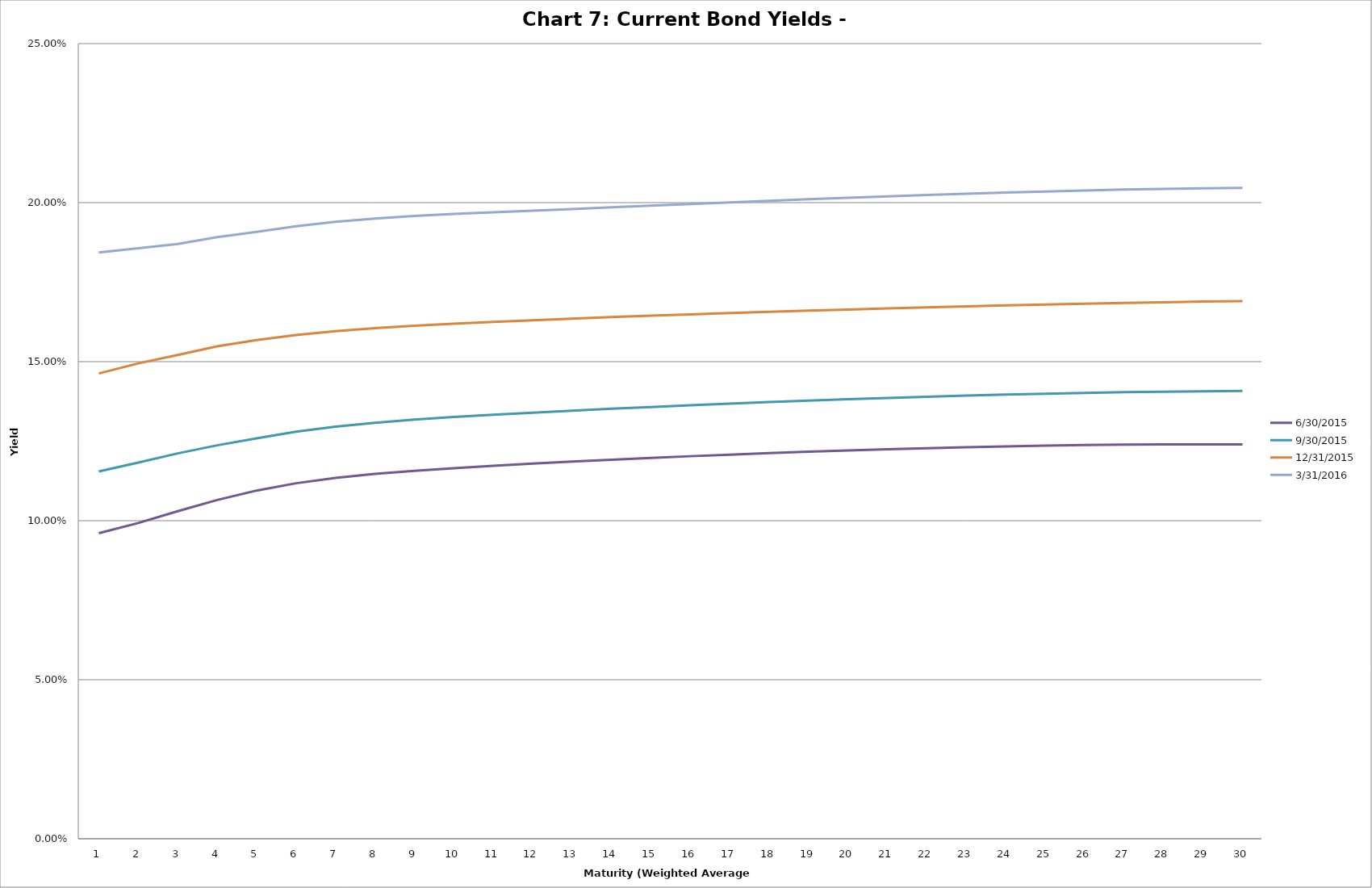
| Category | 6/30/2015 | 9/30/2015 | 12/31/2015 | 3/31/2016 |
|---|---|---|---|---|
| 0 | 0.096 | 0.115 | 0.146 | 0.184 |
| 1 | 0.099 | 0.118 | 0.149 | 0.186 |
| 2 | 0.103 | 0.121 | 0.152 | 0.187 |
| 3 | 0.107 | 0.124 | 0.155 | 0.189 |
| 4 | 0.109 | 0.126 | 0.157 | 0.191 |
| 5 | 0.112 | 0.128 | 0.158 | 0.193 |
| 6 | 0.113 | 0.13 | 0.16 | 0.194 |
| 7 | 0.115 | 0.131 | 0.161 | 0.195 |
| 8 | 0.116 | 0.132 | 0.161 | 0.196 |
| 9 | 0.117 | 0.133 | 0.162 | 0.196 |
| 10 | 0.117 | 0.133 | 0.163 | 0.197 |
| 11 | 0.118 | 0.134 | 0.163 | 0.197 |
| 12 | 0.119 | 0.135 | 0.164 | 0.198 |
| 13 | 0.119 | 0.135 | 0.164 | 0.199 |
| 14 | 0.12 | 0.136 | 0.164 | 0.199 |
| 15 | 0.12 | 0.136 | 0.165 | 0.2 |
| 16 | 0.121 | 0.137 | 0.165 | 0.2 |
| 17 | 0.121 | 0.137 | 0.166 | 0.201 |
| 18 | 0.122 | 0.138 | 0.166 | 0.201 |
| 19 | 0.122 | 0.138 | 0.166 | 0.202 |
| 20 | 0.122 | 0.139 | 0.167 | 0.202 |
| 21 | 0.123 | 0.139 | 0.167 | 0.202 |
| 22 | 0.123 | 0.139 | 0.167 | 0.203 |
| 23 | 0.123 | 0.14 | 0.168 | 0.203 |
| 24 | 0.124 | 0.14 | 0.168 | 0.204 |
| 25 | 0.124 | 0.14 | 0.168 | 0.204 |
| 26 | 0.124 | 0.14 | 0.168 | 0.204 |
| 27 | 0.124 | 0.141 | 0.169 | 0.204 |
| 28 | 0.124 | 0.141 | 0.169 | 0.205 |
| 29 | 0.124 | 0.141 | 0.169 | 0.205 |